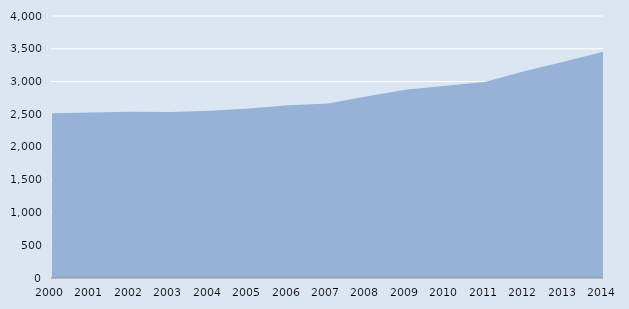
| Category | Series 0 |
|---|---|
| 2000.0 | 2514 |
| 2001.0 | 2526 |
| 2002.0 | 2539 |
| 2003.0 | 2533 |
| 2004.0 | 2552 |
| 2005.0 | 2589 |
| 2006.0 | 2639 |
| 2007.0 | 2664 |
| 2008.0 | 2774 |
| 2009.0 | 2876 |
| 2010.0 | 2936 |
| 2011.0 | 2998 |
| 2012.0 | 3159 |
| 2013.0 | 3307 |
| 2014.0 | 3457 |